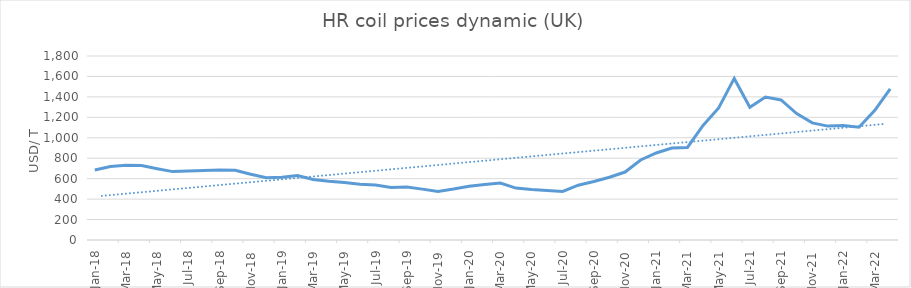
| Category | Series 0 |
|---|---|
| 2018-01-01 | 685.21 |
| 2018-02-01 | 719.524 |
| 2018-03-01 | 730.079 |
| 2018-04-01 | 727.709 |
| 2018-05-01 | 696.888 |
| 2018-06-01 | 668.986 |
| 2018-07-01 | 676.124 |
| 2018-08-01 | 679.436 |
| 2018-09-01 | 683.772 |
| 2018-10-01 | 681.967 |
| 2018-11-01 | 642.591 |
| 2018-12-01 | 609.22 |
| 2019-01-01 | 613.419 |
| 2019-02-01 | 630.144 |
| 2019-03-01 | 591.716 |
| 2019-04-01 | 574.713 |
| 2019-05-01 | 563.196 |
| 2019-06-01 | 545.478 |
| 2019-07-01 | 538.307 |
| 2019-08-01 | 513.161 |
| 2019-09-01 | 518.519 |
| 2019-10-01 | 497.726 |
| 2019-11-01 | 475.578 |
| 2019-12-01 | 499.409 |
| 2020-01-01 | 526.732 |
| 2020-02-01 | 542.355 |
| 2020-03-01 | 557.67 |
| 2020-04-01 | 507.583 |
| 2020-05-01 | 493.34 |
| 2020-06-01 | 483.522 |
| 2020-07-01 | 474.703 |
| 2020-08-01 | 535.948 |
| 2020-09-01 | 572.821 |
| 2020-10-01 | 614.138 |
| 2020-11-01 | 664.824 |
| 2020-12-01 | 782.818 |
| 2021-01-01 | 851.351 |
| 2021-02-01 | 900.22 |
| 2021-03-01 | 905.697 |
| 2021-04-01 | 1120.121 |
| 2021-05-01 | 1291.643 |
| 2021-06-01 | 1580.663 |
| 2021-07-01 | 1297.89 |
| 2021-08-01 | 1398.698 |
| 2021-09-01 | 1370.053 |
| 2021-10-01 | 1236.749 |
| 2021-11-01 | 1146.074 |
| 2021-12-01 | 1114.058 |
| 2022-01-01 | 1120.315 |
| 2022-02-01 | 1103.29 |
| 2022-03-01 | 1265.574 |
| 2022-04-01 | 1478.057 |